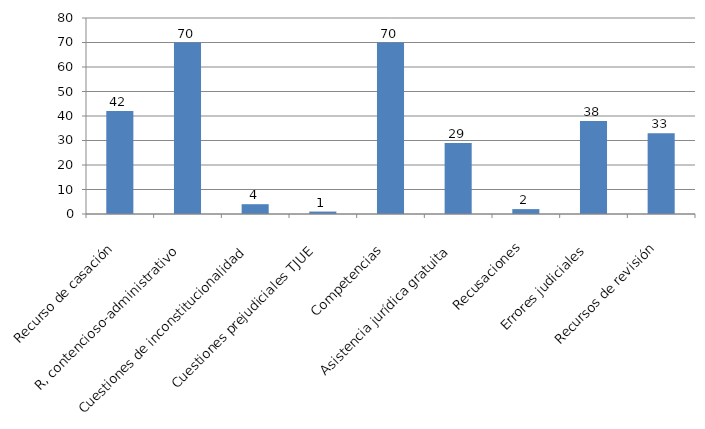
| Category | Series 0 |
|---|---|
| Recurso de casación | 42 |
| R, contencioso-administrativo  | 70 |
| Cuestiones de inconstitucionalidad  | 4 |
| Cuestiones prejudiciales TJUE  | 1 |
| Competencias  | 70 |
| Asistencia jurídica gratuita  | 29 |
| Recusaciones  | 2 |
| Errores judiciales  | 38 |
| Recursos de revisión | 33 |